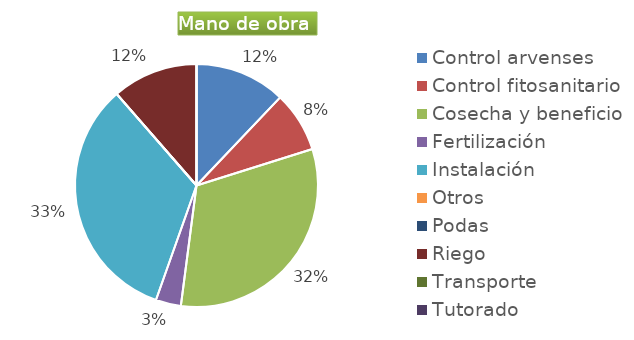
| Category | Series 0 |
|---|---|
| Control arvenses | 1068588 |
| Control fitosanitario | 712392 |
| Cosecha y beneficio | 2819889 |
| Fertilización | 296830 |
| Instalación | 2931261 |
| Otros | 0 |
| Podas | 0 |
| Riego | 1009222 |
| Transporte | 0 |
| Tutorado | 0 |